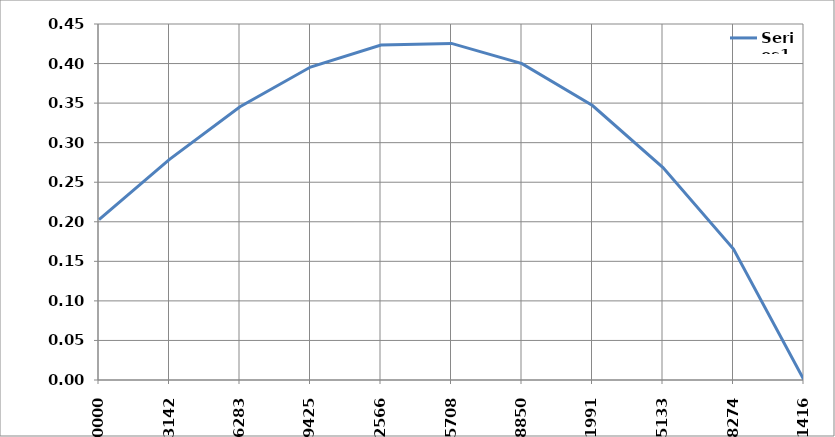
| Category | Series 0 |
|---|---|
| 0.0 | 0.203 |
| 0.3141592653589793 | 0.279 |
| 0.6283185307179586 | 0.345 |
| 0.9424777960769379 | 0.396 |
| 1.2566370614359172 | 0.423 |
| 1.5707963267948966 | 0.425 |
| 1.8849555921538759 | 0.4 |
| 2.199114857512855 | 0.347 |
| 2.5132741228718345 | 0.269 |
| 2.827433388230814 | 0.166 |
| 3.141592653589793 | 0 |